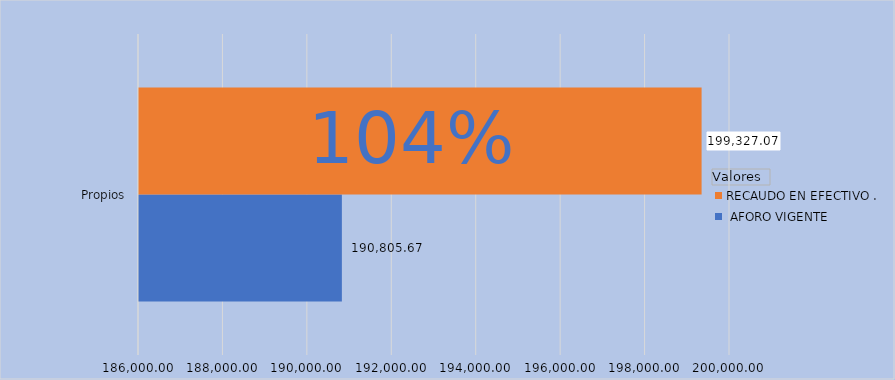
| Category |  AFORO VIGENTE
 | RECAUDO EN EFECTIVO . |
|---|---|---|
| Propios | 190805.67 | 199327.07 |